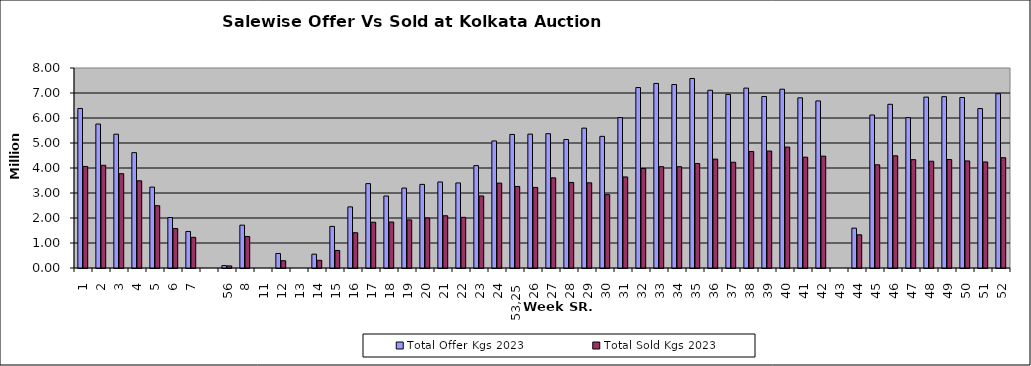
| Category | Total Offer Kgs 2023 | Total Sold Kgs 2023 |
|---|---|---|
| 1 | 6380947.41 | 4062150.5 |
| 2 | 5758702.42 | 4108354.27 |
| 3 | 5352189.13 | 3772186.5 |
| 4 | 4613436.69 | 3487135.99 |
| 5 | 3237029.45 | 2491098.85 |
| 6 | 2019018.7 | 1578626.1 |
| 7 | 1461589.08 | 1225754.08 |
|  | 0 | 0 |
| 56 | 95011.4 | 82804.2 |
| 8 | 1713884.95 | 1260084.3 |
| 11 | 0 | 0 |
| 12 | 580164.8 | 290532.9 |
| 13 | 0 | 0 |
| 14 | 552705.7 | 307808.4 |
| 15 | 1664350 | 701513.5 |
| 16 | 2444710.72 | 1410247.42 |
| 17 | 3375225.55 | 1830548.95 |
| 18 | 2878806.73 | 1840325.48 |
| 19 | 3197438.73 | 1923813.14 |
| 20 | 3344572.85 | 2000671.77 |
| 21 | 3441608.65 | 2089934.35 |
| 22 | 3402498.11 | 2026184.45 |
| 23 | 4095488.09 | 2881788.59 |
| 24 | 5081890.41 | 3394913.5 |
| 53,25 | 5342421.93 | 3262380.23 |
| 26 | 5354527.75 | 3222908.1 |
| 27 | 5372113.75 | 3605799.54 |
| 28 | 5140136.65 | 3422448.05 |
| 29 | 5594827.89 | 3406906.25 |
| 30 | 5266090.28 | 2933255.92 |
| 31 | 6017502.1 | 3641992.6 |
| 32 | 7218709.02 | 3981689.52 |
| 33 | 7382285.08 | 4052507.15 |
| 34 | 7339327.94 | 4051705.28 |
| 35 | 7580434.45 | 4180259.75 |
| 36 | 7110108.4 | 4353892.62 |
| 37 | 6942959.57 | 4229734.07 |
| 38 | 7196142 | 4661039.63 |
| 39 | 6859723.19 | 4677985.14 |
| 40 | 7150645.8 | 4837569.3 |
| 41 | 6806666.65 | 4432190.15 |
| 42 | 6682593.98 | 4473636.43 |
| 43 | 0 | 0 |
| 44 | 1594103.68 | 1327310.96 |
| 45 | 6119091.89 | 4127438.39 |
| 46 | 6547934.4 | 4488472 |
| 47 | 6015990.81 | 4334091.34 |
| 48 | 6835638.19 | 4270384.42 |
| 49 | 6853688.39 | 4337298.6 |
| 50 | 6819803.22 | 4282490.62 |
| 51 | 6376595.52 | 4241144.92 |
| 52 | 6971070.51 | 4411355.51 |